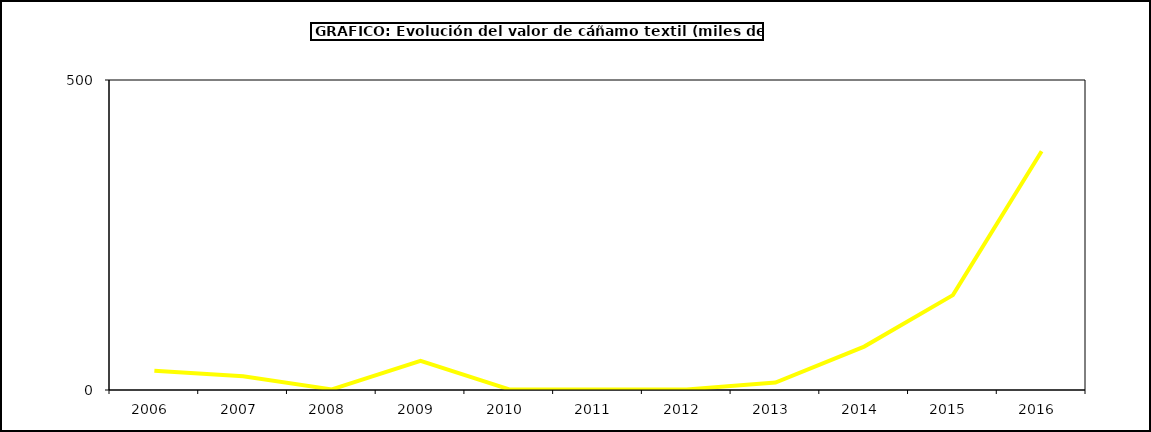
| Category | Valor |
|---|---|
| 2006.0 | 31 |
| 2007.0 | 22 |
| 2008.0 | 1 |
| 2009.0 | 47 |
| 2010.0 | 1 |
| 2011.0 | 1 |
| 2012.0 | 1 |
| 2013.0 | 12 |
| 2014.0 | 70 |
| 2015.0 | 153 |
| 2016.0 | 385 |